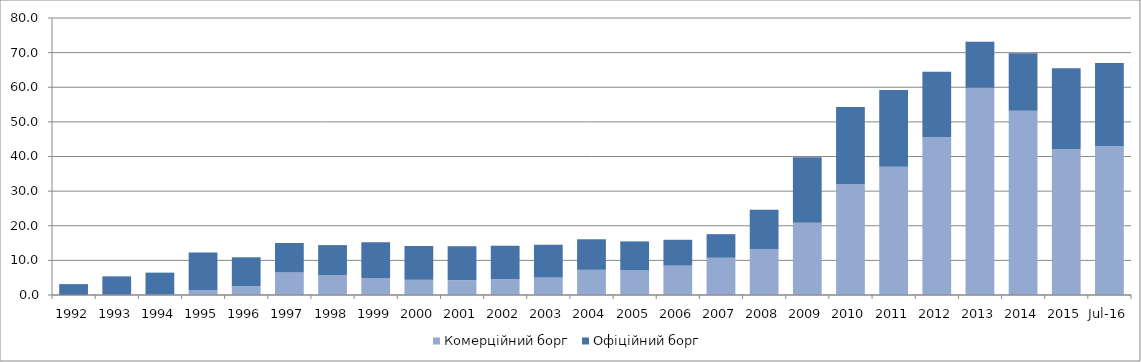
| Category | Комерційний борг | Офіційний борг |
|---|---|---|
| 1992.0 | 0.002 | 3.145 |
| 1993.0 | 0.093 | 5.294 |
| 1994.0 | 0.141 | 6.319 |
| 1995.0 | 1.452 | 10.845 |
| 1996.0 | 2.584 | 8.306 |
| 1997.0 | 6.501 | 8.515 |
| 1998.0 | 5.762 | 8.647 |
| 1999.0 | 4.91 | 10.338 |
| 2000.0 | 4.437 | 9.735 |
| 2001.0 | 4.31 | 9.775 |
| 2002.0 | 4.609 | 9.593 |
| 2003.0 | 5.066 | 9.477 |
| 2004.0 | 7.274 | 8.823 |
| 2005.0 | 7.225 | 8.249 |
| 2006.0 | 8.489 | 7.461 |
| 2007.0 | 10.762 | 6.811 |
| 2008.0 | 13.215 | 11.384 |
| 2009.0 | 20.831 | 18.982 |
| 2010.0 | 32.087 | 22.211 |
| 2011.0 | 37.025 | 22.198 |
| 2012.0 | 45.621 | 18.875 |
| 2013.0 | 59.842 | 13.321 |
| 2014.0 | 53.19 | 16.622 |
| 2015.0 | 42.095 | 23.41 |
| 42582.0 | 43.047 | 23.948 |